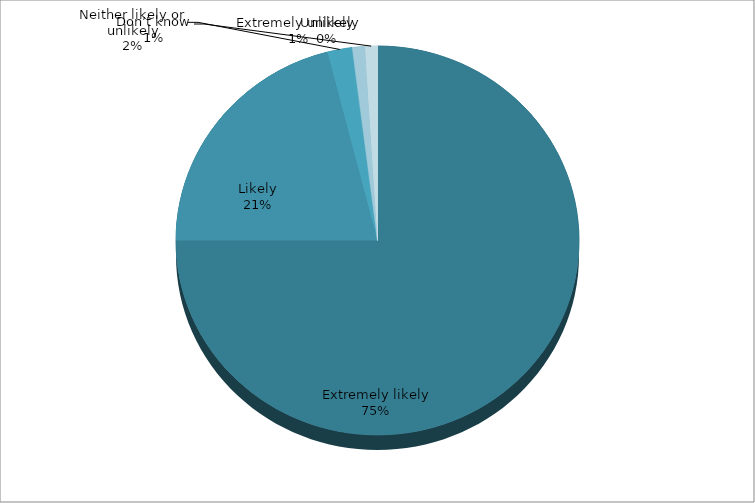
| Category | Series 0 |
|---|---|
| Extremely likely | 75 |
| Likely | 21 |
| Neither likely or unlikely | 2 |
| Unlikely | 0 |
| Extremely unlikely | 1 |
| Don’t know | 1 |